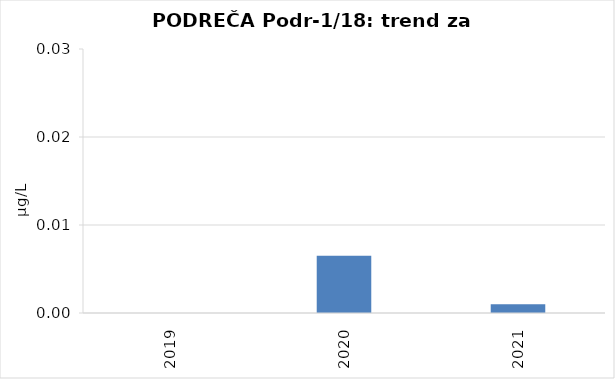
| Category | Vsota |
|---|---|
| 2019 | 0 |
| 2020 | 0.006 |
| 2021 | 0.001 |